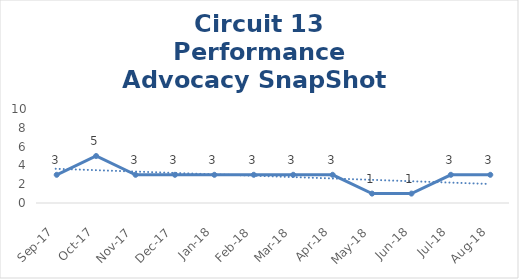
| Category | Circuit 13 |
|---|---|
| Sep-17 | 3 |
| Oct-17 | 5 |
| Nov-17 | 3 |
| Dec-17 | 3 |
| Jan-18 | 3 |
| Feb-18 | 3 |
| Mar-18 | 3 |
| Apr-18 | 3 |
| May-18 | 1 |
| Jun-18 | 1 |
| Jul-18 | 3 |
| Aug-18 | 3 |